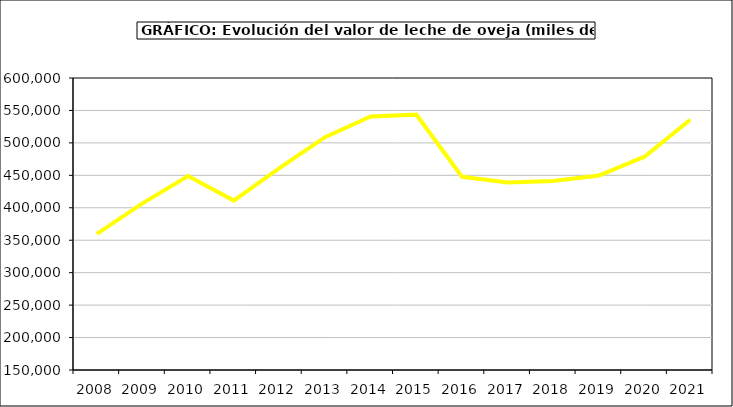
| Category | Leche de oveja |
|---|---|
| 2008.0 | 359891.921 |
| 2009.0 | 406748.92 |
| 2010.0 | 448909.954 |
| 2011.0 | 411088.68 |
| 2012.0 | 461020.54 |
| 2013.0 | 508804.544 |
| 2014.0 | 540718.294 |
| 2015.0 | 543554.103 |
| 2016.0 | 447762.031 |
| 2017.0 | 438875.9 |
| 2018.0 | 441244.511 |
| 2019.0 | 449771.179 |
| 2020.0 | 478705.177 |
| 2021.0 | 535706.579 |